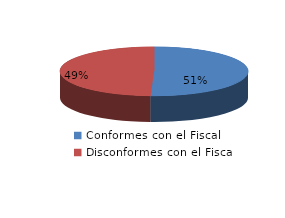
| Category | Series 0 |
|---|---|
| 0 | 45 |
| 1 | 44 |